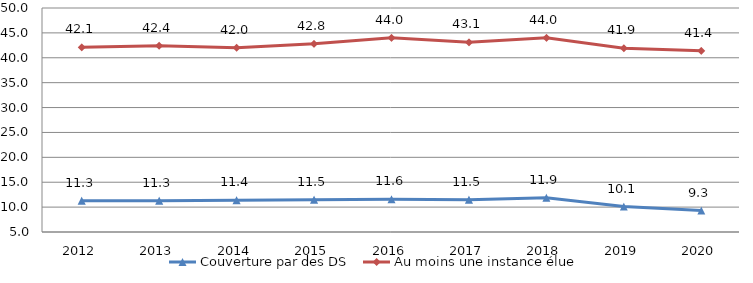
| Category | Couverture par des DS | Au moins une instance élue |
|---|---|---|
| 2012.0 | 11.3 | 42.1 |
| 2013.0 | 11.3 | 42.4 |
| 2014.0 | 11.4 | 42 |
| 2015.0 | 11.5 | 42.8 |
| 2016.0 | 11.6 | 44 |
| 2017.0 | 11.5 | 43.1 |
| 2018.0 | 11.9 | 44 |
| 2019.0 | 10.1 | 41.9 |
| 2020.0 | 9.3 | 41.4 |